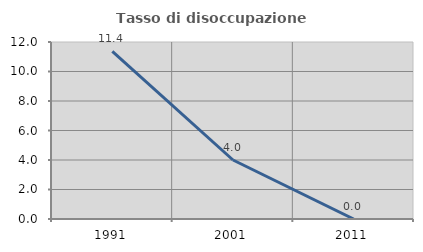
| Category | Tasso di disoccupazione giovanile  |
|---|---|
| 1991.0 | 11.364 |
| 2001.0 | 4 |
| 2011.0 | 0 |